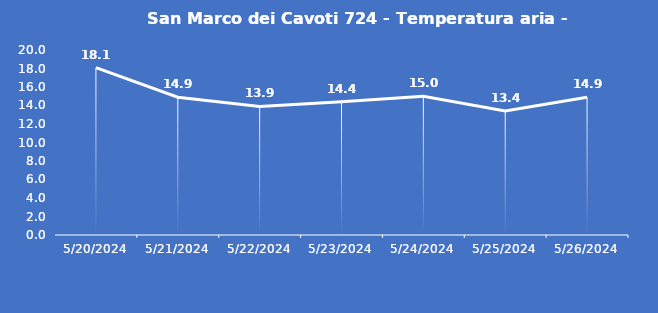
| Category | San Marco dei Cavoti 724 - Temperatura aria - Grezzo (°C) |
|---|---|
| 5/20/24 | 18.1 |
| 5/21/24 | 14.9 |
| 5/22/24 | 13.9 |
| 5/23/24 | 14.4 |
| 5/24/24 | 15 |
| 5/25/24 | 13.4 |
| 5/26/24 | 14.9 |